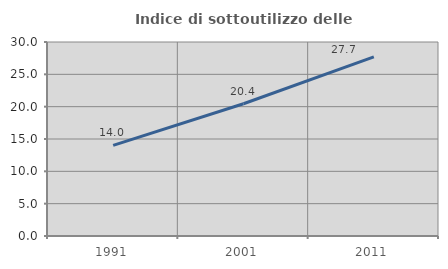
| Category | Indice di sottoutilizzo delle abitazioni  |
|---|---|
| 1991.0 | 14.013 |
| 2001.0 | 20.449 |
| 2011.0 | 27.692 |